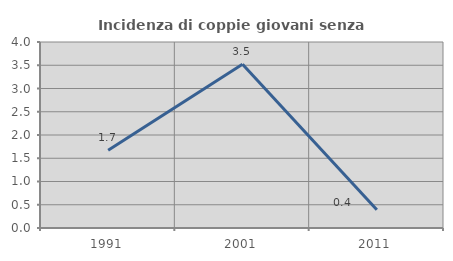
| Category | Incidenza di coppie giovani senza figli |
|---|---|
| 1991.0 | 1.672 |
| 2001.0 | 3.521 |
| 2011.0 | 0.394 |